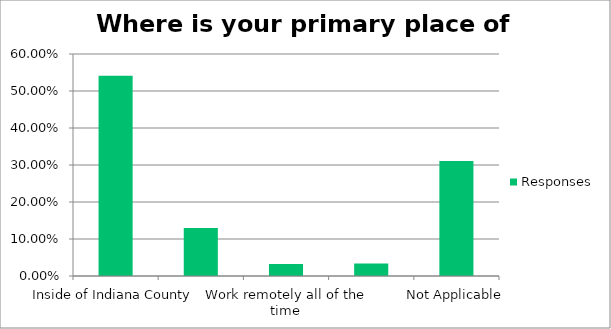
| Category | Responses |
|---|---|
| Inside of Indiana County | 0.541 |
| Outside of Indiana County | 0.129 |
| Work remotely all of the time | 0.032 |
| Work remotely part of the time | 0.034 |
| Not Applicable | 0.311 |